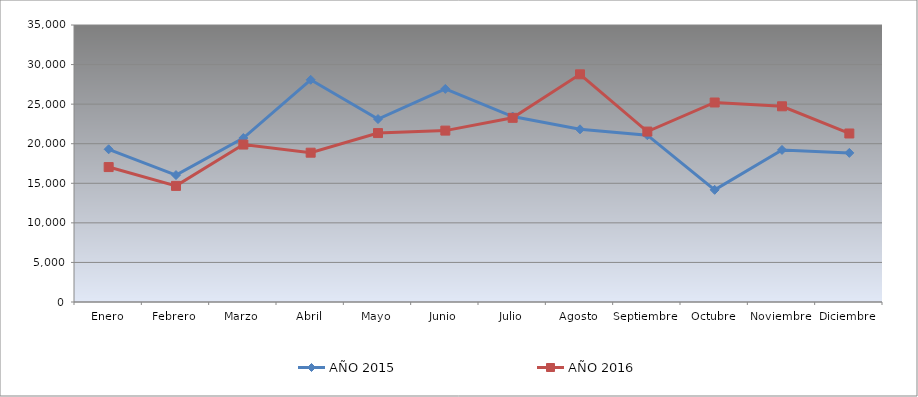
| Category | AÑO 2015 | AÑO 2016 |
|---|---|---|
| Enero | 19294.657 | 17049.263 |
| Febrero | 16037.863 | 14670.998 |
| Marzo | 20716.957 | 19893.825 |
| Abril | 28077.584 | 18864.652 |
| Mayo | 23116.144 | 21344.778 |
| Junio | 26924.042 | 21656.397 |
| Julio | 23430.197 | 23272.591 |
| Agosto | 21819.164 | 28768.556 |
| Septiembre | 21076.307 | 21534.164 |
| Octubre | 14173.171 | 25209.458 |
| Noviembre | 19213.879 | 24728.071 |
| Diciembre | 18840.186 | 21292.715 |